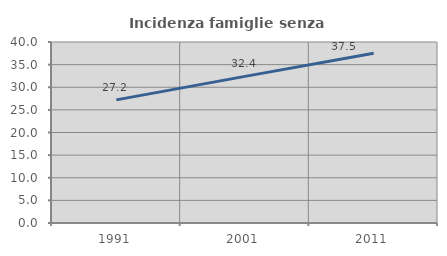
| Category | Incidenza famiglie senza nuclei |
|---|---|
| 1991.0 | 27.215 |
| 2001.0 | 32.401 |
| 2011.0 | 37.515 |